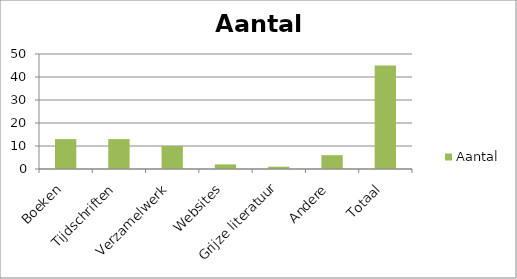
| Category | Aantal |
|---|---|
| Boeken | 13 |
| Tijdschriften | 13 |
| Verzamelwerk | 10 |
| Websites | 2 |
| Grijze literatuur | 1 |
| Andere | 6 |
| Totaal | 45 |